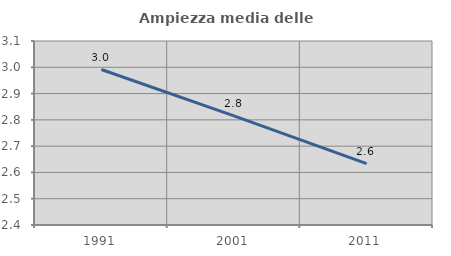
| Category | Ampiezza media delle famiglie |
|---|---|
| 1991.0 | 2.991 |
| 2001.0 | 2.815 |
| 2011.0 | 2.634 |